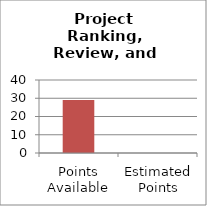
| Category | Project Ranking, Review, and Capacity |
|---|---|
| Points Available | 29 |
| Estimated Points | 0 |